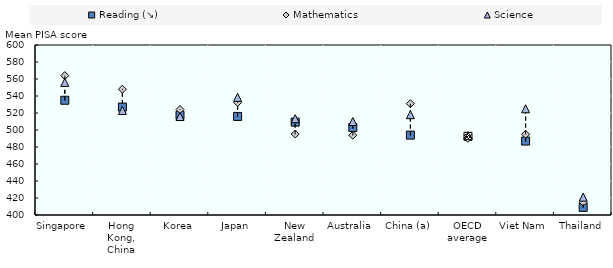
| Category | Reading (↘) | Mathematics | Science |
|---|---|---|---|
| Singapore | 535 | 564 | 556 |
| Hong Kong, China | 527 | 548 | 523 |
| Korea | 517.437 | 524.106 | 515.81 |
| Japan | 515.958 | 532.44 | 538.395 |
| New Zealand | 509.271 | 495.223 | 513.304 |
| Australia | 502.901 | 493.896 | 509.994 |
| China (a) | 494 | 531 | 518 |
| OECD average | 492.549 | 490.204 | 493.202 |
| Viet Nam | 487 | 495 | 525 |
| Thailand | 409 | 415 | 421 |